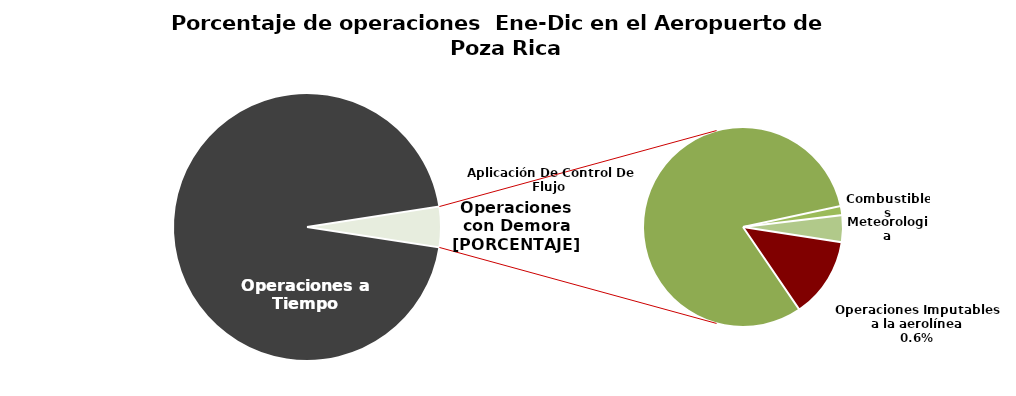
| Category | Series 0 |
|---|---|
| Operaciones a Tiempo | 1345 |
| Operaciones Imputables a la aerolínea | 9 |
| Aplicación De Control De Flujo  | 56 |
| Combustibles | 1 |
| Meteorologia | 3 |